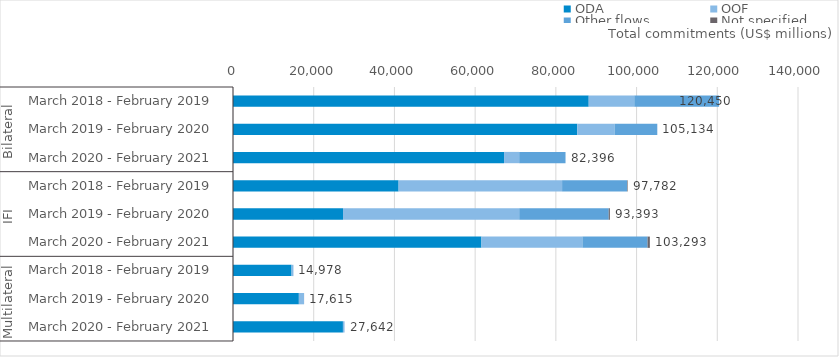
| Category | ODA | OOF | Other flows | Not specified | Total |
|---|---|---|---|---|---|
| 0 | 88142.476 | 11287.891 | 21019.101 | 0.797 | 120450.263 |
| 1 | 85298.679 | 9237.157 | 10593.118 | 5.117 | 105134.071 |
| 2 | 67164.847 | 3751.128 | 11479.421 | 0.557 | 82395.953 |
| 3 | 41034.097 | 40512.355 | 16090.763 | 144.412 | 97781.628 |
| 4 | 27260.783 | 43660.354 | 22180.763 | 290.775 | 93392.675 |
| 5 | 61557.106 | 25022.906 | 16140.116 | 572.77 | 103292.897 |
| 6 | 14505.625 | 471.936 | 0 | 0 | 14977.561 |
| 7 | 16317.699 | 1290.643 | 0 | 6.962 | 17615.304 |
| 8 | 27239.445 | 402.36 | 0 | 0 | 27641.805 |